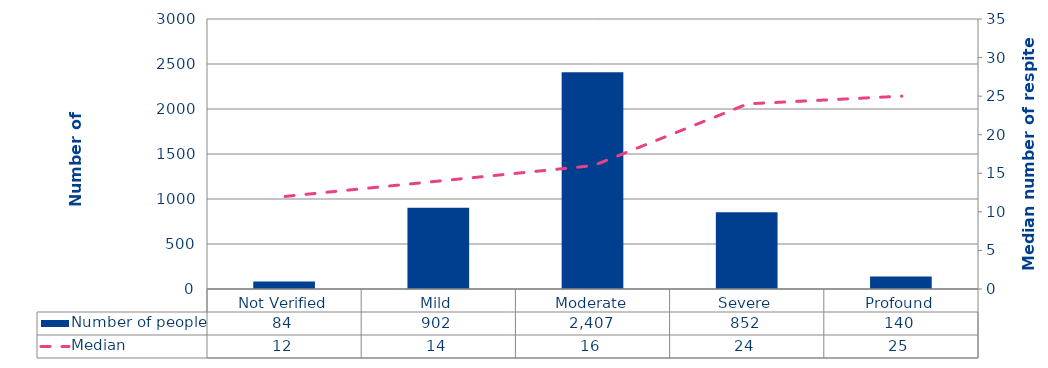
| Category | Number of people |
|---|---|
| Not Verified | 84 |
| Mild | 902 |
| Moderate | 2407 |
| Severe | 852 |
| Profound | 140 |